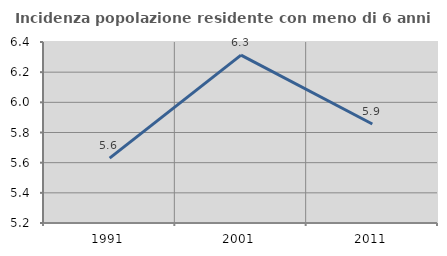
| Category | Incidenza popolazione residente con meno di 6 anni |
|---|---|
| 1991.0 | 5.63 |
| 2001.0 | 6.313 |
| 2011.0 | 5.857 |